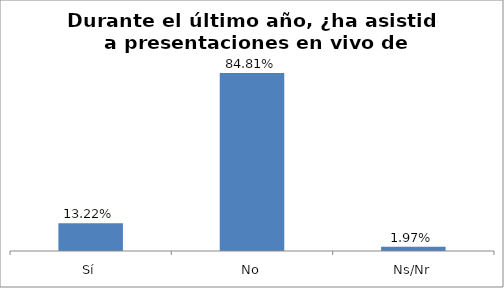
| Category | Total |
|---|---|
| Sí | 0.132 |
| No | 0.848 |
| Ns/Nr | 0.02 |